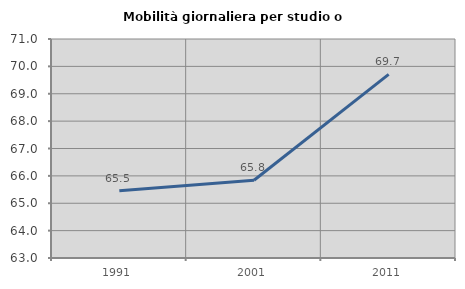
| Category | Mobilità giornaliera per studio o lavoro |
|---|---|
| 1991.0 | 65.454 |
| 2001.0 | 65.841 |
| 2011.0 | 69.705 |